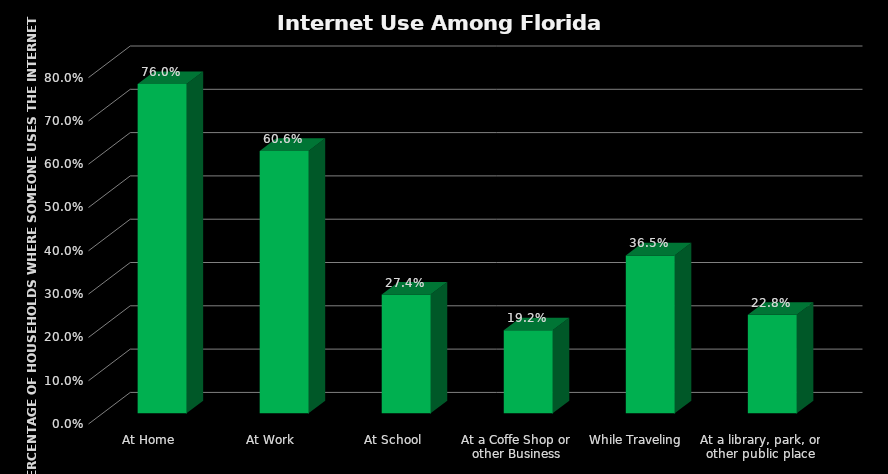
| Category | Series 0 |
|---|---|
| At Home | 0.76 |
| At Work | 0.606 |
| At School | 0.274 |
| At a Coffe Shop or other Business | 0.192 |
| While Traveling | 0.365 |
| At a library, park, or other public place | 0.228 |